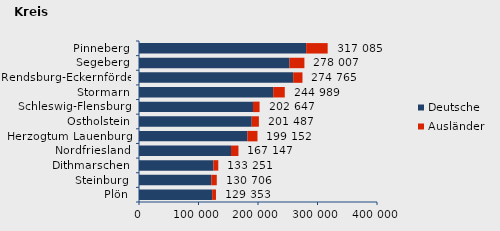
| Category | Deutsche | Ausländer | Series 2 |
|---|---|---|---|
| Plön | 122945 | 6408 | 129353 |
| Steinburg | 121513 | 9193 | 130706 |
| Dithmarschen | 125060 | 8191 | 133251 |
| Nordfriesland | 154637 | 12510 | 167147 |
| Herzogtum Lauenburg | 182146 | 17006 | 199152 |
| Ostholstein | 189439 | 12048 | 201487 |
| Schleswig-Flensburg | 191589 | 11058 | 202647 |
| Stormarn | 225543 | 19446 | 244989 |
| Rendsburg-Eckernförde | 259138 | 15627 | 274765 |
| Segeberg | 252952 | 25055 | 278007 |
| Pinneberg | 280914 | 36171 | 317085 |